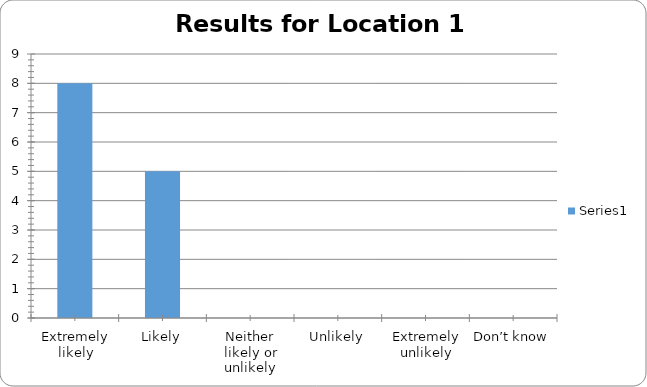
| Category | Series 0 |
|---|---|
| Extremely likely | 8 |
| Likely | 5 |
| Neither likely or unlikely | 0 |
| Unlikely | 0 |
| Extremely unlikely | 0 |
| Don’t know | 0 |